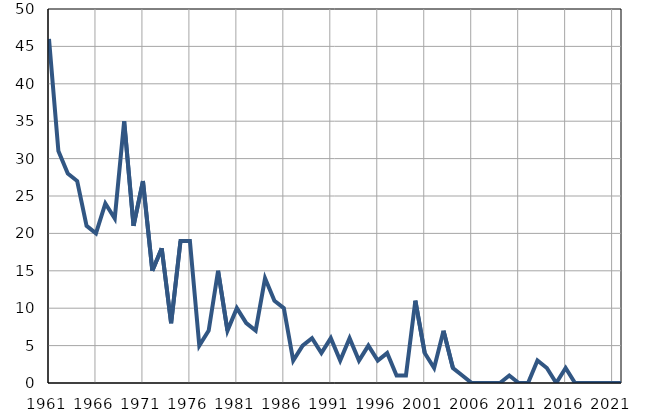
| Category | Умрла 
одојчад |
|---|---|
| 1961.0 | 46 |
| 1962.0 | 31 |
| 1963.0 | 28 |
| 1964.0 | 27 |
| 1965.0 | 21 |
| 1966.0 | 20 |
| 1967.0 | 24 |
| 1968.0 | 22 |
| 1969.0 | 35 |
| 1970.0 | 21 |
| 1971.0 | 27 |
| 1972.0 | 15 |
| 1973.0 | 18 |
| 1974.0 | 8 |
| 1975.0 | 19 |
| 1976.0 | 19 |
| 1977.0 | 5 |
| 1978.0 | 7 |
| 1979.0 | 15 |
| 1980.0 | 7 |
| 1981.0 | 10 |
| 1982.0 | 8 |
| 1983.0 | 7 |
| 1984.0 | 14 |
| 1985.0 | 11 |
| 1986.0 | 10 |
| 1987.0 | 3 |
| 1988.0 | 5 |
| 1989.0 | 6 |
| 1990.0 | 4 |
| 1991.0 | 6 |
| 1992.0 | 3 |
| 1993.0 | 6 |
| 1994.0 | 3 |
| 1995.0 | 5 |
| 1996.0 | 3 |
| 1997.0 | 4 |
| 1998.0 | 1 |
| 1999.0 | 1 |
| 2000.0 | 11 |
| 2001.0 | 4 |
| 2002.0 | 2 |
| 2003.0 | 7 |
| 2004.0 | 2 |
| 2005.0 | 1 |
| 2006.0 | 0 |
| 2007.0 | 0 |
| 2008.0 | 0 |
| 2009.0 | 0 |
| 2010.0 | 1 |
| 2011.0 | 0 |
| 2012.0 | 0 |
| 2013.0 | 3 |
| 2014.0 | 2 |
| 2015.0 | 0 |
| 2016.0 | 2 |
| 2017.0 | 0 |
| 2018.0 | 0 |
| 2019.0 | 0 |
| 2020.0 | 0 |
| 2021.0 | 0 |
| 2022.0 | 0 |